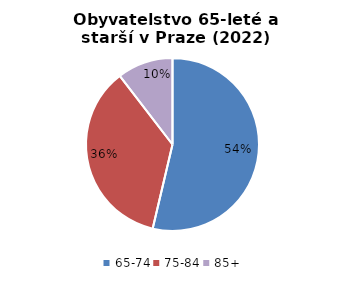
| Category | Series 0 |
|---|---|
| 65-74 | 136849 |
| 75-84 | 91445 |
| 85+ | 26602 |